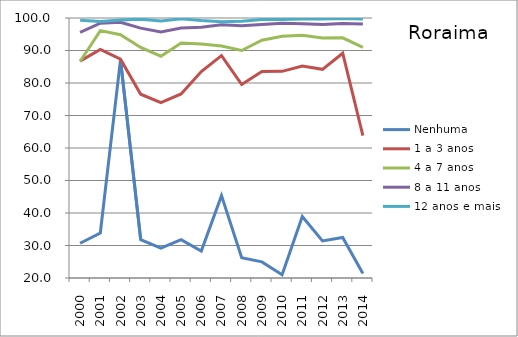
| Category | Nenhuma | 1 a 3 anos | 4 a 7 anos | 8 a 11 anos | 12 anos e mais |
|---|---|---|---|---|---|
| 2000.0 | 30.68 | 86.744 | 86.601 | 95.607 | 99.345 |
| 2001.0 | 33.857 | 90.348 | 96.128 | 98.384 | 98.947 |
| 2002.0 | 87.109 | 87.317 | 94.858 | 98.697 | 99.36 |
| 2003.0 | 31.799 | 76.55 | 90.947 | 96.891 | 99.648 |
| 2004.0 | 29.223 | 73.945 | 88.239 | 95.702 | 99.101 |
| 2005.0 | 31.795 | 76.638 | 92.31 | 96.913 | 99.739 |
| 2006.0 | 28.271 | 83.537 | 91.968 | 97.156 | 99.209 |
| 2007.0 | 45.337 | 88.427 | 91.404 | 97.893 | 98.851 |
| 2008.0 | 26.24 | 79.524 | 90.008 | 97.616 | 98.997 |
| 2009.0 | 24.958 | 83.536 | 93.146 | 97.98 | 99.533 |
| 2010.0 | 20.996 | 83.578 | 94.393 | 98.411 | 99.532 |
| 2011.0 | 38.94 | 85.227 | 94.655 | 98.201 | 99.693 |
| 2012.0 | 31.429 | 84.211 | 93.821 | 97.969 | 99.717 |
| 2013.0 | 32.477 | 89.153 | 93.908 | 98.272 | 99.872 |
| 2014.0 | 21.369 | 63.813 | 90.985 | 98.151 | 99.696 |